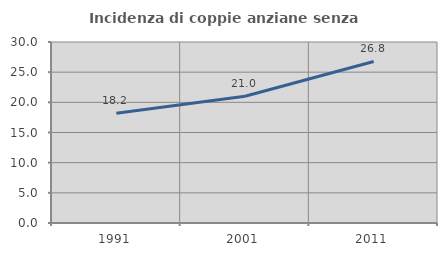
| Category | Incidenza di coppie anziane senza figli  |
|---|---|
| 1991.0 | 18.182 |
| 2001.0 | 21.014 |
| 2011.0 | 26.772 |